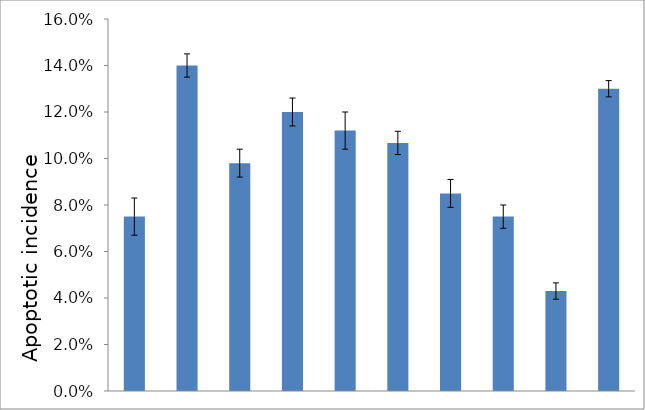
| Category | Series 0 |
|---|---|
| 0 | 0.075 |
| 1 | 0.14 |
| 2 | 0.098 |
| 3 | 0.12 |
| 4 | 0.112 |
| 5 | 0.107 |
| 6 | 0.085 |
| 7 | 0.075 |
| 8 | 0.043 |
| 9 | 0.13 |